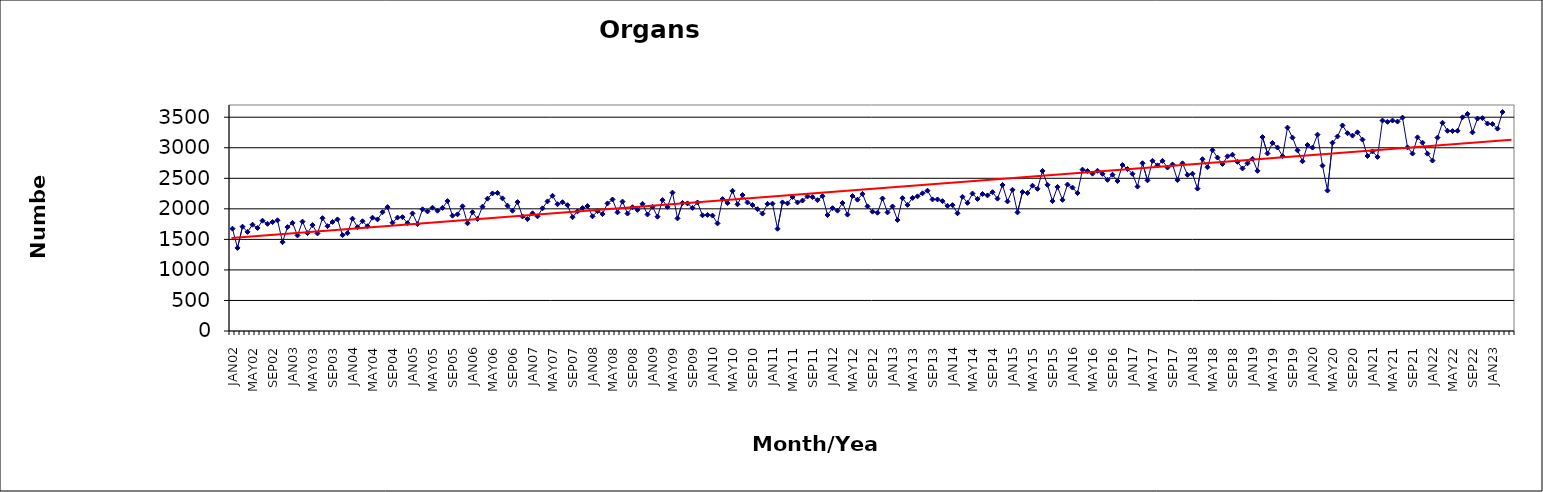
| Category | Series 0 |
|---|---|
| JAN02 | 1675 |
| FEB02 | 1360 |
| MAR02 | 1708 |
| APR02 | 1623 |
| MAY02 | 1740 |
| JUN02 | 1687 |
| JUL02 | 1806 |
| AUG02 | 1755 |
| SEP02 | 1783 |
| OCT02 | 1813 |
| NOV02 | 1455 |
| DEC02 | 1701 |
| JAN03 | 1770 |
| FEB03 | 1565 |
| MAR03 | 1791 |
| APR03 | 1603 |
| MAY03 | 1734 |
| JUN03 | 1598 |
| JUL03 | 1847 |
| AUG03 | 1716 |
| SEP03 | 1785 |
| OCT03 | 1827 |
| NOV03 | 1570 |
| DEC03 | 1602 |
| JAN04 | 1839 |
| FEB04 | 1700 |
| MAR04 | 1797 |
| APR04 | 1715 |
| MAY04 | 1855 |
| JUN04 | 1827 |
| JUL04 | 1945 |
| AUG04 | 2028 |
| SEP04 | 1773 |
| OCT04 | 1857 |
| NOV04 | 1864 |
| DEC04 | 1766 |
| JAN05 | 1925 |
| FEB05 | 1750 |
| MAR05 | 1993 |
| APR05 | 1957 |
| MAY05 | 2018 |
| JUN05 | 1969 |
| JUL05 | 2016 |
| AUG05 | 2127 |
| SEP05 | 1888 |
| OCT05 | 1910 |
| NOV05 | 2042 |
| DEC05 | 1764 |
| JAN06 | 1945 |
| FEB06 | 1834 |
| MAR06 | 2035 |
| APR06 | 2167 |
| MAY06 | 2252 |
| JUN06 | 2261 |
| JUL06 | 2172 |
| AUG06 | 2051 |
| SEP06 | 1969 |
| OCT06 | 2111 |
| NOV06 | 1875 |
| DEC06 | 1832 |
| JAN07 | 1927 |
| FEB07 | 1878 |
| MAR07 | 2009 |
| APR07 | 2122 |
| MAY07 | 2214 |
| JUN07 | 2076 |
| JUL07 | 2108 |
| AUG07 | 2060 |
| SEP07 | 1863 |
| OCT07 | 1959 |
| NOV07 | 2012 |
| DEC07 | 2046 |
| JAN08 | 1878 |
| FEB08 | 1962 |
| MAR08 | 1914 |
| APR08 | 2089 |
| MAY08 | 2153 |
| JUN08 | 1942 |
| JUL08 | 2119 |
| AUG08 | 1923 |
| SEP08 | 2026 |
| OCT08 | 1983 |
| NOV08 | 2082 |
| DEC08 | 1908 |
| JAN09 | 2033 |
| FEB09 | 1871 |
| MAR09 | 2143 |
| APR09 | 2032 |
| MAY09 | 2266 |
| JUN09 | 1844 |
| JUL09 | 2096 |
| AUG09 | 2089 |
| SEP09 | 2016 |
| OCT09 | 2104 |
| NOV09 | 1894 |
| DEC09 | 1901 |
| JAN10 | 1890 |
| FEB10 | 1761 |
| MAR10 | 2160 |
| APR10 | 2094 |
| MAY10 | 2295 |
| JUN10 | 2075 |
| JUL10 | 2226 |
| AUG10 | 2104 |
| SEP10 | 2062 |
| OCT10 | 1994 |
| NOV10 | 1922 |
| DEC10 | 2082 |
| JAN11 | 2085 |
| FEB11 | 1674 |
| MAR11 | 2106 |
| APR11 | 2090 |
| MAY11 | 2194 |
| JUN11 | 2105 |
| JUL11 | 2136 |
| AUG11 | 2202 |
| SEP11 | 2192 |
| OCT11 | 2142 |
| NOV11 | 2207 |
| DEC11 | 1899 |
| JAN12 | 2011 |
| FEB12 | 1970 |
| MAR12 | 2096 |
| APR12 | 1906 |
| MAY12 | 2210 |
| JUN12 | 2150 |
| JUL12 | 2244 |
| AUG12 | 2041 |
| SEP12 | 1954 |
| OCT12 | 1936 |
| NOV12 | 2170 |
| DEC12 | 1941 |
| JAN13 | 2039 |
| FEB13 | 1816 |
| MAR13 | 2175 |
| APR13 | 2065 |
| MAY13 | 2179 |
| JUN13 | 2205 |
| JUL13 | 2254 |
| AUG13 | 2297 |
| SEP13 | 2154 |
| OCT13 | 2154 |
| NOV13 | 2126 |
| DEC13 | 2049 |
| JAN14 | 2061 |
| FEB14 | 1927 |
| MAR14 | 2197 |
| APR14 | 2098 |
| MAY14 | 2251 |
| JUN14 | 2162 |
| JUL14 | 2243 |
| AUG14 | 2220 |
| SEP14 | 2272 |
| OCT14 | 2167 |
| NOV14 | 2391 |
| DEC14 | 2121 |
| JAN15 | 2312 |
| FEB15 | 1942 |
| MAR15 | 2275 |
| APR15 | 2259 |
| MAY15 | 2379 |
| JUN15 | 2328 |
| JUL15 | 2621 |
| AUG15 | 2393 |
| SEP15 | 2127 |
| OCT15 | 2359 |
| NOV15 | 2147 |
| DEC15 | 2398 |
| JAN16 | 2348 |
| FEB16 | 2258 |
| MAR16 | 2642 |
| APR16 | 2619 |
| MAY16 | 2576 |
| JUN16 | 2623 |
| JUL16 | 2573 |
| AUG16 | 2475 |
| SEP16 | 2559 |
| OCT16 | 2455 |
| NOV16 | 2717 |
| DEC16 | 2652 |
| JAN17 | 2574 |
| FEB17 | 2364 |
| MAR17 | 2747 |
| APR17 | 2466 |
| MAY17 | 2786 |
| JUN17 | 2712 |
| JUL17 | 2785 |
| AUG17 | 2676 |
| SEP17 | 2726 |
| OCT17 | 2470 |
| NOV17 | 2745 |
| DEC17 | 2557 |
| JAN18 | 2575 |
| FEB18 | 2331 |
| MAR18 | 2813 |
| APR18 | 2681 |
| MAY18 | 2960 |
| JUN18 | 2839 |
| JUL18 | 2735 |
| AUG18 | 2860 |
| SEP18 | 2886 |
| OCT18 | 2769 |
| NOV18 | 2661 |
| DEC18 | 2745 |
| JAN19 | 2819 |
| FEB19 | 2622 |
| MAR19 | 3175 |
| APR19 | 2906 |
| MAY19 | 3079 |
| JUN19 | 3004 |
| JUL19 | 2863 |
| AUG19 | 3330 |
| SEP19 | 3166 |
| OCT19 | 2958 |
| NOV19 | 2779 |
| DEC19 | 3045 |
| JAN20 | 3002 |
| FEB20 | 3214 |
| MAR20 | 2707 |
| APR20 | 2299 |
| MAY20 | 3082 |
| JUN20 | 3185 |
| JUL20 | 3365 |
| AUG20 | 3238 |
| SEP20 | 3199 |
| OCT20 | 3253 |
| NOV20 | 3133 |
| DEC20 | 2865 |
| JAN21 | 2939 |
| FEB21 | 2850 |
| MAR21 | 3446 |
| APR21 | 3424 |
| MAY21 | 3446 |
| JUN21 | 3429 |
| JUL21 | 3494 |
| AUG21 | 3006 |
| SEP21 | 2905 |
| OCT21 | 3170 |
| NOV21 | 3083 |
| DEC21 | 2903 |
| JAN22 | 2790 |
| FEB22 | 3166 |
| MAR22 | 3409 |
| APR22 | 3278 |
| MAY22 | 3273 |
| JUN22 | 3278 |
| JUL22 | 3499 |
| AUG22 | 3554 |
| SEP22 | 3252 |
| OCT22 | 3478 |
| NOV22 | 3485 |
| DEC22 | 3397 |
| JAN23 | 3388 |
| FEB23 | 3313 |
| MAR23 | 3585 |